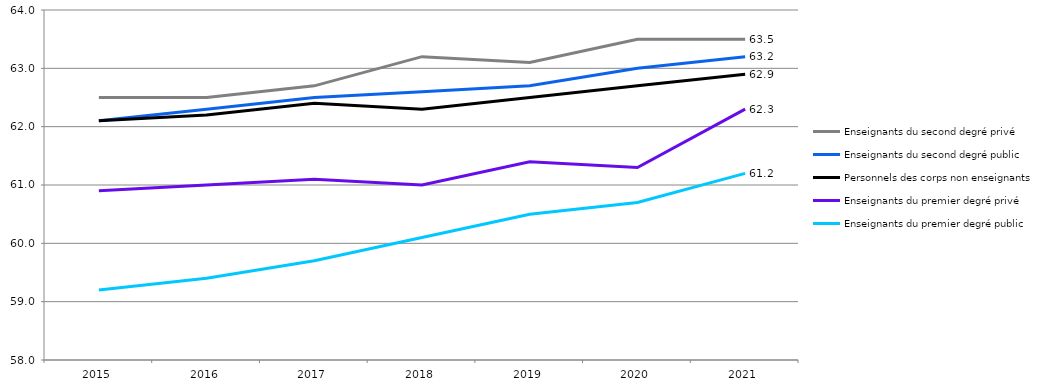
| Category | Enseignants du second degré privé | Enseignants du second degré public | Personnels des corps non enseignants  | Enseignants du premier degré privé | Enseignants du premier degré public |
|---|---|---|---|---|---|
| 2015.0 | 62.5 | 62.1 | 62.1 | 60.9 | 59.2 |
| 2016.0 | 62.5 | 62.3 | 62.2 | 61 | 59.4 |
| 2017.0 | 62.7 | 62.5 | 62.4 | 61.1 | 59.7 |
| 2018.0 | 63.2 | 62.6 | 62.3 | 61 | 60.1 |
| 2019.0 | 63.1 | 62.7 | 62.5 | 61.4 | 60.5 |
| 2020.0 | 63.5 | 63 | 62.7 | 61.3 | 60.7 |
| 2021.0 | 63.5 | 63.2 | 62.9 | 62.3 | 61.2 |